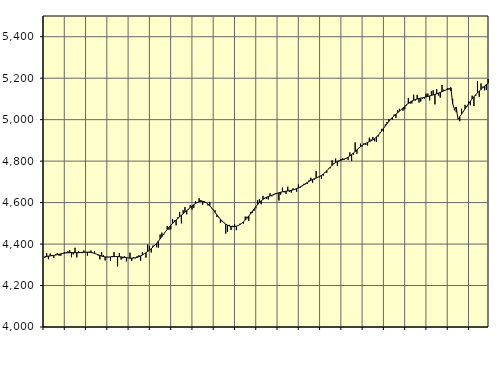
| Category | Piggar | Series 1 |
|---|---|---|
| nan | 4334.2 | 4339.69 |
| 1.0 | 4355.4 | 4340.64 |
| 1.0 | 4326.9 | 4341.66 |
| 1.0 | 4354.1 | 4342.77 |
| 1.0 | 4346.4 | 4343.97 |
| 1.0 | 4333.1 | 4345.29 |
| 1.0 | 4349.9 | 4347.05 |
| 1.0 | 4356.6 | 4348.73 |
| 1.0 | 4343.8 | 4350.78 |
| 1.0 | 4343.7 | 4352.78 |
| 1.0 | 4356.4 | 4354.63 |
| 1.0 | 4361.3 | 4356.15 |
| nan | 4360.5 | 4357.28 |
| 2.0 | 4365.7 | 4358.07 |
| 2.0 | 4371.5 | 4358.52 |
| 2.0 | 4336.2 | 4358.7 |
| 2.0 | 4349.8 | 4358.64 |
| 2.0 | 4382 | 4358.5 |
| 2.0 | 4335.7 | 4358.42 |
| 2.0 | 4366 | 4358.53 |
| 2.0 | 4361 | 4358.98 |
| 2.0 | 4356.2 | 4359.68 |
| 2.0 | 4369.2 | 4360.35 |
| 2.0 | 4361.3 | 4360.81 |
| nan | 4344.3 | 4360.84 |
| 3.0 | 4362.8 | 4360.28 |
| 3.0 | 4368.7 | 4359.13 |
| 3.0 | 4356.9 | 4357.38 |
| 3.0 | 4366.3 | 4355 |
| 3.0 | 4351.8 | 4352 |
| 3.0 | 4345 | 4348.61 |
| 3.0 | 4326.1 | 4345.21 |
| 3.0 | 4361.1 | 4342.1 |
| 3.0 | 4346.4 | 4339.65 |
| 3.0 | 4321 | 4338.04 |
| 3.0 | 4338.7 | 4337.37 |
| nan | 4336.6 | 4337.59 |
| 4.0 | 4319.8 | 4338.27 |
| 4.0 | 4342.5 | 4339.05 |
| 4.0 | 4361.2 | 4339.65 |
| 4.0 | 4338.8 | 4339.91 |
| 4.0 | 4292.6 | 4339.68 |
| 4.0 | 4356.1 | 4339.01 |
| 4.0 | 4325.3 | 4338.06 |
| 4.0 | 4331.2 | 4336.82 |
| 4.0 | 4341.5 | 4335.35 |
| 4.0 | 4316.5 | 4334.06 |
| 4.0 | 4332.6 | 4333.02 |
| nan | 4358.5 | 4332.24 |
| 5.0 | 4319.9 | 4332.03 |
| 5.0 | 4335.6 | 4332.52 |
| 5.0 | 4331.1 | 4333.72 |
| 5.0 | 4341.4 | 4335.78 |
| 5.0 | 4346.2 | 4338.94 |
| 5.0 | 4319.2 | 4342.96 |
| 5.0 | 4360.2 | 4347.56 |
| 5.0 | 4352.2 | 4352.71 |
| 5.0 | 4334.5 | 4358.34 |
| 5.0 | 4397.7 | 4364.35 |
| 5.0 | 4389.2 | 4370.87 |
| nan | 4359.3 | 4378.01 |
| 6.0 | 4393.1 | 4385.75 |
| 6.0 | 4393.9 | 4394.26 |
| 6.0 | 4384.5 | 4403.66 |
| 6.0 | 4382.9 | 4413.92 |
| 6.0 | 4446.1 | 4424.8 |
| 6.0 | 4455 | 4436.33 |
| 6.0 | 4444.4 | 4448.13 |
| 6.0 | 4459.9 | 4459.6 |
| 6.0 | 4487.4 | 4470.58 |
| 6.0 | 4469.2 | 4480.85 |
| 6.0 | 4471 | 4490.17 |
| nan | 4521.1 | 4498.87 |
| 7.0 | 4514.3 | 4507.31 |
| 7.0 | 4490.4 | 4515.5 |
| 7.0 | 4529.3 | 4523.61 |
| 7.0 | 4555 | 4531.63 |
| 7.0 | 4499.6 | 4539.42 |
| 7.0 | 4563 | 4546.91 |
| 7.0 | 4578.3 | 4554.3 |
| 7.0 | 4543.5 | 4561.73 |
| 7.0 | 4567 | 4569.19 |
| 7.0 | 4587.7 | 4576.52 |
| 7.0 | 4566.5 | 4583.65 |
| nan | 4574.8 | 4590.28 |
| 8.0 | 4606.3 | 4596.03 |
| 8.0 | 4602.5 | 4600.81 |
| 8.0 | 4621 | 4604.35 |
| 8.0 | 4612.4 | 4606.29 |
| 8.0 | 4589.3 | 4606.33 |
| 8.0 | 4600.1 | 4604.27 |
| 8.0 | 4600 | 4599.82 |
| 8.0 | 4585.8 | 4593.13 |
| 8.0 | 4603.3 | 4584.59 |
| 8.0 | 4573.1 | 4574.66 |
| 8.0 | 4565.7 | 4563.82 |
| nan | 4562.7 | 4552.57 |
| 9.0 | 4530.4 | 4541.34 |
| 9.0 | 4528.6 | 4530.44 |
| 9.0 | 4503 | 4520.19 |
| 9.0 | 4507.1 | 4510.88 |
| 9.0 | 4504.5 | 4502.85 |
| 9.0 | 4450.5 | 4496.2 |
| 9.0 | 4458.4 | 4490.91 |
| 9.0 | 4492.8 | 4487.11 |
| 9.0 | 4467.9 | 4484.73 |
| 9.0 | 4488.6 | 4483.73 |
| 9.0 | 4496.3 | 4484.2 |
| nan | 4466.8 | 4486.14 |
| 10.0 | 4489.2 | 4489.42 |
| 10.0 | 4498.1 | 4493.98 |
| 10.0 | 4500.3 | 4499.88 |
| 10.0 | 4498.6 | 4507.02 |
| 10.0 | 4532.6 | 4515.27 |
| 10.0 | 4532.1 | 4524.61 |
| 10.0 | 4512.4 | 4534.98 |
| 10.0 | 4554 | 4546.05 |
| 10.0 | 4550.7 | 4557.57 |
| 10.0 | 4560.2 | 4569.18 |
| 10.0 | 4572.7 | 4580.4 |
| nan | 4612 | 4590.89 |
| 11.0 | 4617.2 | 4600.41 |
| 11.0 | 4592 | 4608.72 |
| 11.0 | 4632.4 | 4615.62 |
| 11.0 | 4623.1 | 4621.19 |
| 11.0 | 4617.2 | 4625.68 |
| 11.0 | 4615.3 | 4629.26 |
| 11.0 | 4644.9 | 4632.39 |
| 11.0 | 4630.3 | 4635.45 |
| 11.0 | 4636 | 4638.49 |
| 11.0 | 4644.2 | 4641.61 |
| 11.0 | 4645.3 | 4644.75 |
| nan | 4610.2 | 4647.58 |
| 12.0 | 4638.2 | 4649.97 |
| 12.0 | 4671.8 | 4651.94 |
| 12.0 | 4649.7 | 4653.57 |
| 12.0 | 4641.9 | 4654.9 |
| 12.0 | 4676.6 | 4656.22 |
| 12.0 | 4650.9 | 4657.71 |
| 12.0 | 4648.6 | 4659.41 |
| 12.0 | 4669.2 | 4661.51 |
| 12.0 | 4662.9 | 4664.23 |
| 12.0 | 4652.6 | 4667.47 |
| 12.0 | 4686.9 | 4671.22 |
| nan | 4671.8 | 4675.55 |
| 13.0 | 4678.6 | 4680.49 |
| 13.0 | 4690.1 | 4685.94 |
| 13.0 | 4688.2 | 4691.57 |
| 13.0 | 4689.7 | 4697.22 |
| 13.0 | 4707.4 | 4702.58 |
| 13.0 | 4719.9 | 4707.42 |
| 13.0 | 4696 | 4711.69 |
| 13.0 | 4710.3 | 4715.44 |
| 13.0 | 4751.7 | 4718.85 |
| 13.0 | 4723.7 | 4722.47 |
| 13.0 | 4722.7 | 4726.73 |
| nan | 4713.8 | 4731.85 |
| 14.0 | 4729.5 | 4738.04 |
| 14.0 | 4746.3 | 4745.3 |
| 14.0 | 4744.1 | 4753.48 |
| 14.0 | 4763.7 | 4762.31 |
| 14.0 | 4765.9 | 4771.2 |
| 14.0 | 4804 | 4779.71 |
| 14.0 | 4789.5 | 4787.42 |
| 14.0 | 4812.4 | 4793.77 |
| 14.0 | 4776.7 | 4798.58 |
| 14.0 | 4799.9 | 4802.05 |
| 14.0 | 4810.7 | 4804.74 |
| nan | 4813.3 | 4807.28 |
| 15.0 | 4807.8 | 4810.23 |
| 15.0 | 4811.1 | 4814.01 |
| 15.0 | 4806.2 | 4818.97 |
| 15.0 | 4842.3 | 4825.03 |
| 15.0 | 4800.3 | 4831.93 |
| 15.0 | 4831.1 | 4839.31 |
| 15.0 | 4890.7 | 4846.9 |
| 15.0 | 4835.7 | 4854.65 |
| 15.0 | 4860.4 | 4862.29 |
| 15.0 | 4884.3 | 4869.53 |
| 15.0 | 4871.3 | 4875.9 |
| nan | 4886.2 | 4881.34 |
| 16.0 | 4878.3 | 4885.93 |
| 16.0 | 4875.2 | 4889.96 |
| 16.0 | 4913.2 | 4893.78 |
| 16.0 | 4905 | 4897.89 |
| 16.0 | 4916.6 | 4902.8 |
| 16.0 | 4896.2 | 4908.92 |
| 16.0 | 4892.3 | 4916.34 |
| 16.0 | 4918.5 | 4925.01 |
| 16.0 | 4937.9 | 4934.93 |
| 16.0 | 4956 | 4945.73 |
| 16.0 | 4943.3 | 4957.15 |
| nan | 4976.7 | 4968.94 |
| 17.0 | 4989.1 | 4980.66 |
| 17.0 | 5002.5 | 4991.74 |
| 17.0 | 5002.3 | 5001.83 |
| 17.0 | 5000.2 | 5010.85 |
| 17.0 | 5024.9 | 5018.9 |
| 17.0 | 5008.9 | 5026.35 |
| 17.0 | 5045.9 | 5033.59 |
| 17.0 | 5052.6 | 5040.96 |
| 17.0 | 5048.3 | 5048.61 |
| 17.0 | 5043 | 5056.51 |
| 17.0 | 5050.5 | 5064.48 |
| nan | 5068 | 5072.16 |
| 18.0 | 5104.8 | 5079.03 |
| 18.0 | 5077.1 | 5085 |
| 18.0 | 5078.6 | 5089.94 |
| 18.0 | 5120.5 | 5093.82 |
| 18.0 | 5092.3 | 5097.02 |
| 18.0 | 5119.6 | 5099.61 |
| 18.0 | 5082.6 | 5101.81 |
| 18.0 | 5087.9 | 5103.84 |
| 18.0 | 5101.3 | 5105.76 |
| 18.0 | 5101.5 | 5107.71 |
| 18.0 | 5124.8 | 5109.81 |
| nan | 5125.9 | 5112.02 |
| 19.0 | 5093 | 5114.33 |
| 19.0 | 5137.3 | 5116.83 |
| 19.0 | 5141.7 | 5119.48 |
| 19.0 | 5073.8 | 5122.2 |
| 19.0 | 5147.1 | 5125.04 |
| 19.0 | 5115.9 | 5128.11 |
| 19.0 | 5106.1 | 5131.47 |
| 19.0 | 5167.8 | 5135.06 |
| 19.0 | 5145.2 | 5138.69 |
| 19.0 | 5142.9 | 5142.23 |
| 19.0 | 5151.7 | 5145.78 |
| nan | 5145.3 | 5149.57 |
| 20.0 | 5138 | 5154.17 |
| 20.0 | 5100.5 | 5077.54 |
| 20.0 | 5044.9 | 5051.25 |
| 20.0 | 5035.7 | 5060.41 |
| 20.0 | 5003.1 | 5002.05 |
| 20.0 | 4992.5 | 5013.85 |
| 20.0 | 5052.7 | 5026.41 |
| 20.0 | 5036.9 | 5039.23 |
| 20.0 | 5071.4 | 5051.96 |
| 20.0 | 5061.6 | 5064.63 |
| 20.0 | 5088 | 5076.93 |
| nan | 5069.5 | 5088.7 |
| 21.0 | 5115.6 | 5099.85 |
| 21.0 | 5065.9 | 5110.26 |
| 21.0 | 5114.3 | 5119.9 |
| 21.0 | 5185.6 | 5129.06 |
| 21.0 | 5110.5 | 5137.83 |
| 21.0 | 5174.8 | 5146.14 |
| 21.0 | 5158.9 | 5154.04 |
| 21.0 | 5141.4 | 5161.5 |
| 21.0 | 5143.7 | 5168.73 |
| 21.0 | 5196 | 5175.88 |